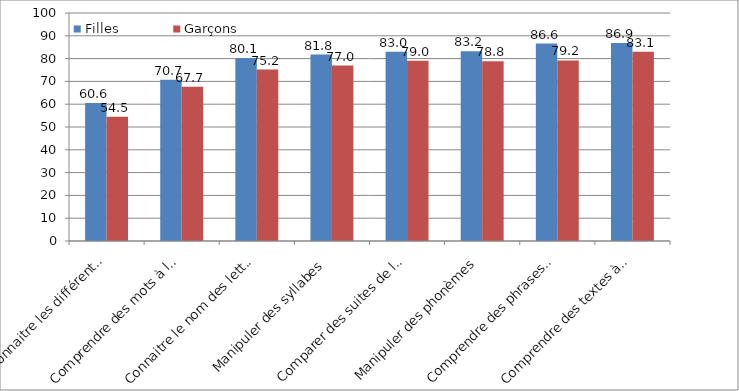
| Category | Filles  | Garçons |
|---|---|---|
| Reconnaitre les différentes écritures d’une lettre | 60.56 | 54.5 |
| Comprendre des mots à l'oral | 70.67 | 67.66 |
| Connaitre le nom des lettres et le son qu’elles produisent  | 80.11 | 75.18 |
| Manipuler des syllabes  | 81.79 | 76.97 |
| Comparer des suites de lettres | 82.95 | 79.02 |
| Manipuler des phonèmes | 83.17 | 78.83 |
| Comprendre des phrases à l'oral | 86.57 | 79.19 |
| Comprendre des textes à l'oral | 86.87 | 83.05 |